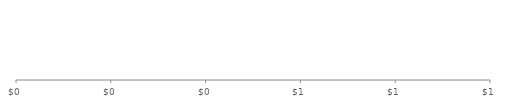
| Category | Month Totals |
|---|---|
| Expenditures | 0 |
| Income | 0 |